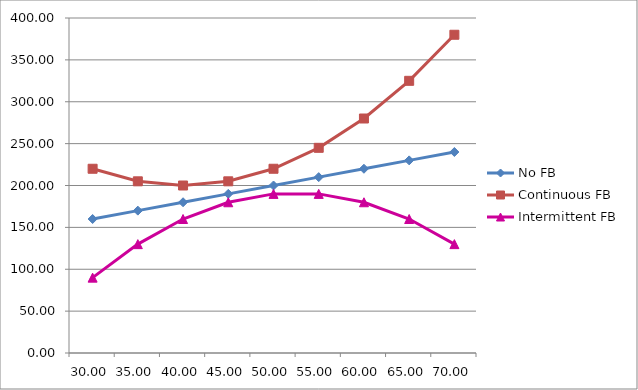
| Category | No FB | Continuous FB | Intermittent FB |
|---|---|---|---|
| 30.0 | 160 | 220 | 90 |
| 35.0 | 170 | 205 | 130 |
| 40.0 | 180 | 200 | 160 |
| 45.0 | 190 | 205 | 180 |
| 50.0 | 200 | 220 | 190 |
| 55.0 | 210 | 245 | 190 |
| 60.0 | 220 | 280 | 180 |
| 65.0 | 230 | 325 | 160 |
| 70.0 | 240 | 380 | 130 |